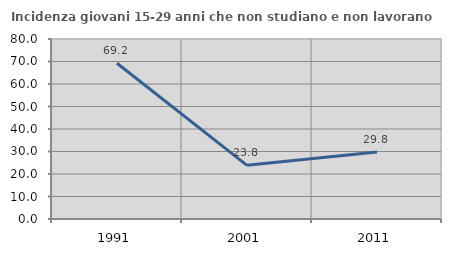
| Category | Incidenza giovani 15-29 anni che non studiano e non lavorano  |
|---|---|
| 1991.0 | 69.246 |
| 2001.0 | 23.837 |
| 2011.0 | 29.781 |